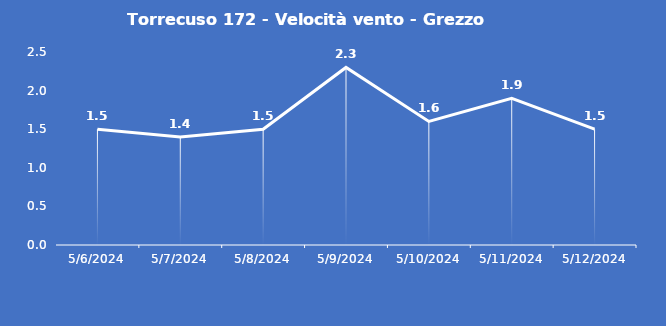
| Category | Torrecuso 172 - Velocità vento - Grezzo (m/s) |
|---|---|
| 5/6/24 | 1.5 |
| 5/7/24 | 1.4 |
| 5/8/24 | 1.5 |
| 5/9/24 | 2.3 |
| 5/10/24 | 1.6 |
| 5/11/24 | 1.9 |
| 5/12/24 | 1.5 |